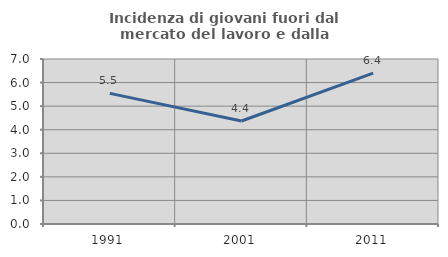
| Category | Incidenza di giovani fuori dal mercato del lavoro e dalla formazione  |
|---|---|
| 1991.0 | 5.541 |
| 2001.0 | 4.37 |
| 2011.0 | 6.398 |